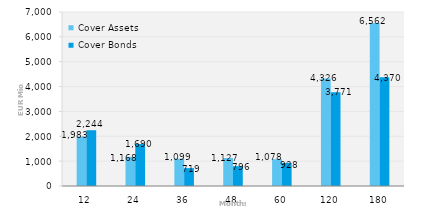
| Category | Cover Assets | Cover Bonds |
|---|---|---|
| 12.0 | 1983.221 | 2244.43 |
| 24.0 | 1168.444 | 1690.276 |
| 36.0 | 1099.367 | 719.377 |
| 48.0 | 1126.993 | 796 |
| 60.0 | 1077.904 | 927.673 |
| 120.0 | 4325.51 | 3770.823 |
| 180.0 | 6562.468 | 4370.172 |